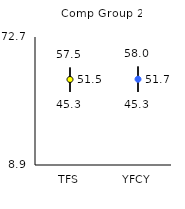
| Category | 25th | 75th | Mean |
|---|---|---|---|
| TFS | 45.3 | 57.5 | 51.53 |
| YFCY | 45.3 | 58 | 51.65 |